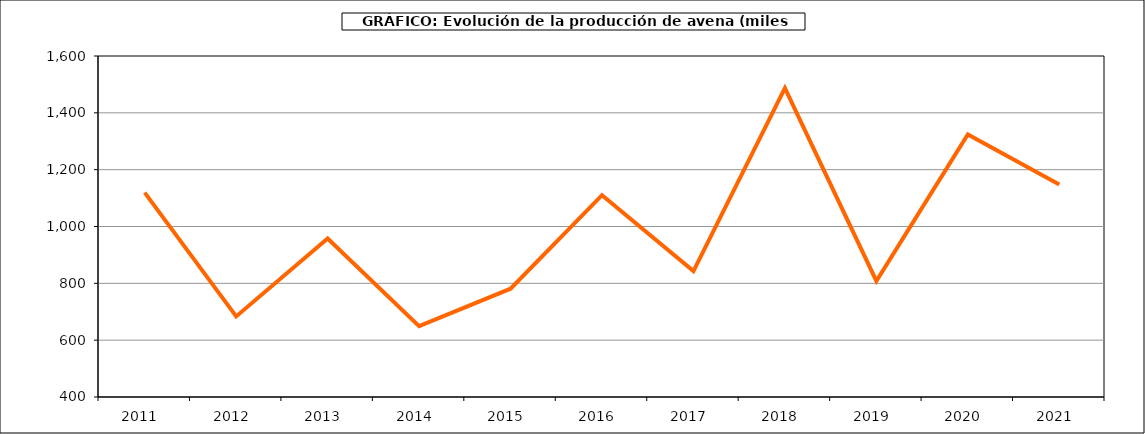
| Category | Superficie |
|---|---|
| 2011.0 | 1119.214 |
| 2012.0 | 683.482 |
| 2013.0 | 957.662 |
| 2014.0 | 649.194 |
| 2015.0 | 781.048 |
| 2016.0 | 1110.117 |
| 2017.0 | 843.259 |
| 2018.0 | 1486.948 |
| 2019.0 | 808.306 |
| 2020.0 | 1323.815 |
| 2021.0 | 1147.791 |